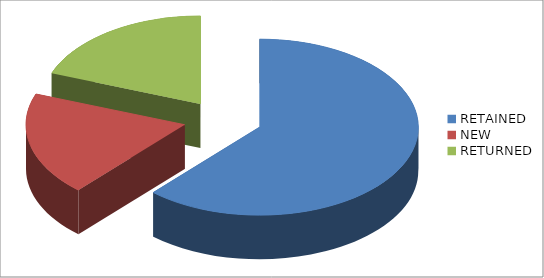
| Category | Series 0 |
|---|---|
| RETAINED | 1928 |
| NEW  | 594 |
| RETURNED | 604 |